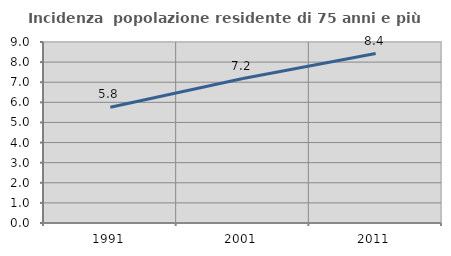
| Category | Incidenza  popolazione residente di 75 anni e più |
|---|---|
| 1991.0 | 5.753 |
| 2001.0 | 7.182 |
| 2011.0 | 8.424 |